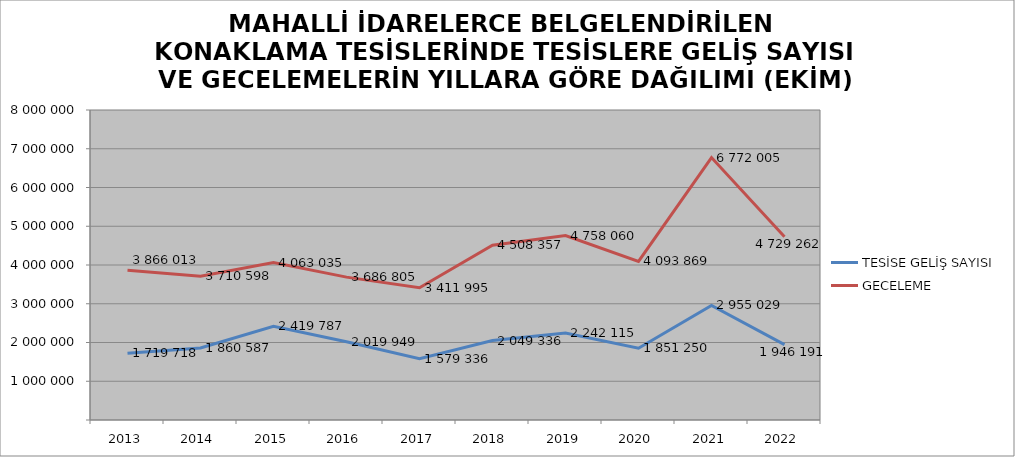
| Category | TESİSE GELİŞ SAYISI | GECELEME |
|---|---|---|
| 2013 | 1719718 | 3866013 |
| 2014 | 1860587 | 3710598 |
| 2015 | 2419787 | 4063035 |
| 2016 | 2019949 | 3686805 |
| 2017 | 1579336 | 3411995 |
| 2018 | 2049336 | 4508357 |
| 2019 | 2242115 | 4758060 |
| 2020 | 1851250 | 4093869 |
| 2021 | 2955029 | 6772005 |
| 2022 | 1946191 | 4729262 |